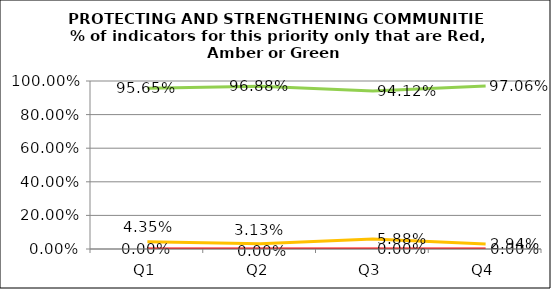
| Category | Green | Amber | Red |
|---|---|---|---|
| Q1 | 0.957 | 0.043 | 0 |
| Q2 | 0.969 | 0.031 | 0 |
| Q3 | 0.941 | 0.059 | 0 |
| Q4 | 0.971 | 0.029 | 0 |